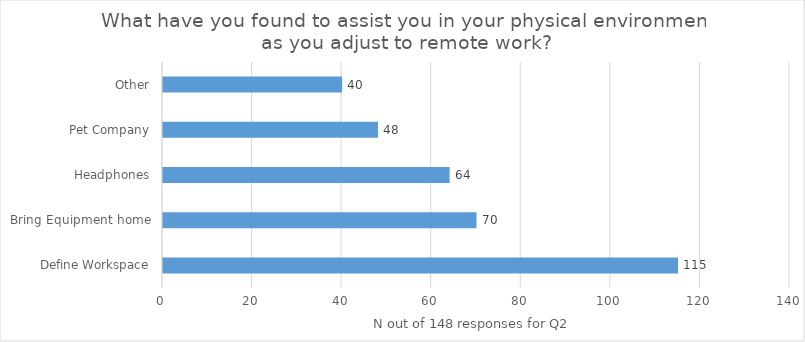
| Category | All Responses |
|---|---|
| Define Workspace | 115 |
| Bring Equipment home | 70 |
| Headphones | 64 |
| Pet Company | 48 |
| Other | 40 |